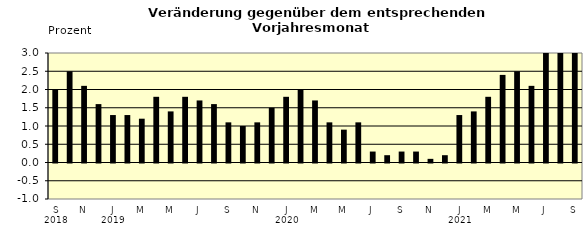
| Category | Series 0 |
|---|---|
| 0 | 2 |
| 1 | 2.5 |
| 2 | 2.1 |
| 3 | 1.6 |
| 4 | 1.3 |
| 5 | 1.3 |
| 6 | 1.2 |
| 7 | 1.8 |
| 8 | 1.4 |
| 9 | 1.8 |
| 10 | 1.7 |
| 11 | 1.6 |
| 12 | 1.1 |
| 13 | 1 |
| 14 | 1.1 |
| 15 | 1.5 |
| 16 | 1.8 |
| 17 | 2 |
| 18 | 1.7 |
| 19 | 1.1 |
| 20 | 0.9 |
| 21 | 1.1 |
| 22 | 0.3 |
| 23 | 0.2 |
| 24 | 0.3 |
| 25 | 0.3 |
| 26 | 0.1 |
| 27 | 0.2 |
| 28 | 1.3 |
| 29 | 1.4 |
| 30 | 1.8 |
| 31 | 2.4 |
| 32 | 2.5 |
| 33 | 2.1 |
| 34 | 3.7 |
| 35 | 3.8 |
| 36 | 4.1 |